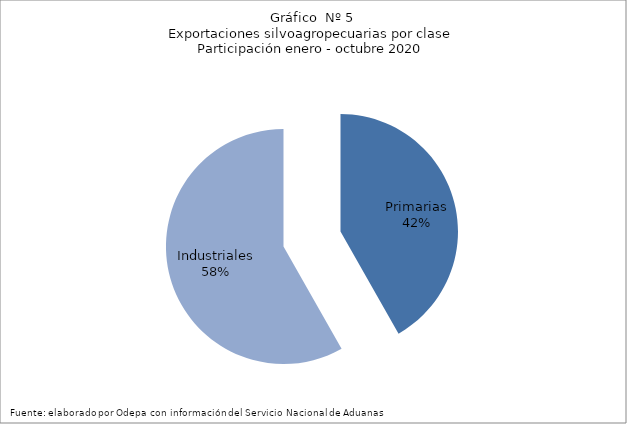
| Category | Series 0 |
|---|---|
| Primarias | 5477687 |
| Industriales | 7635485 |